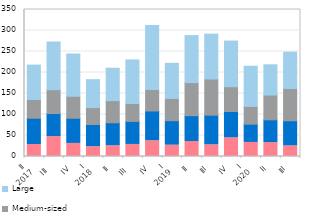
| Category | Micro | Small | Medium-sized | Large |
|---|---|---|---|---|
| II 
2017 | 28.601 | 62.573 | 44.608 | 81.806 |
| III  | 47.306 | 54.987 | 56.8 | 113.518 |
| IV | 31.129 | 59.946 | 52.372 | 100.581 |
| I 
2018 | 23.458 | 52.774 | 40.183 | 66.517 |
| II | 25.544 | 54.802 | 52.603 | 77.229 |
| III  | 28.673 | 54.873 | 42.484 | 103.899 |
| IV | 37.41 | 70.984 | 51.038 | 152.215 |
| I 
2019 | 26.913 | 58.293 | 53.033 | 83.702 |
| II | 35.763 | 61.475 | 78.723 | 111.897 |
| III | 27.759 | 70.634 | 86.103 | 106.825 |
| IV | 44.489 | 62.561 | 59.132 | 108.665 |
| I 
2020 | 33.497 | 43.549 | 42.255 | 95.672 |
| II | 32.96 | 54.335 | 59 | 72.028 |
| III | 25.293 | 59.78 | 76.792 | 86.501 |